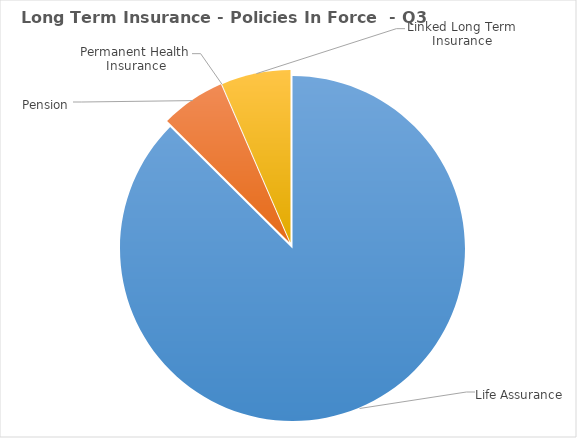
| Category | Series 0 |
|---|---|
| Life Assurance | 554264 |
| Pension | 38303 |
| Permanent Health Insurance | 105 |
| Linked Long Term Insurance | 41127 |